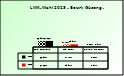
| Category | 2018 | 2023 |
|---|---|---|
| Bgld. Bauernbund | 0.669 | 0.671 |
| SPÖ Bauern | 0.277 | 0.3 |
| Freiheitliche Bauern | 0.038 | 0.03 |